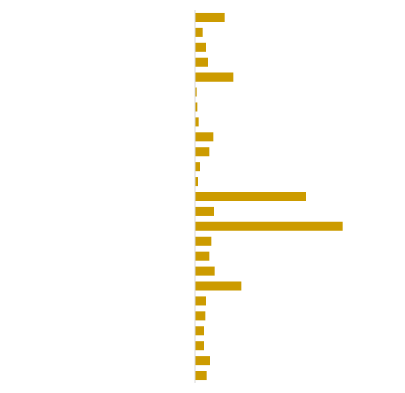
| Category | Total |
|---|---|
| Баацагаан сум | 16 |
| Баянбулаг сум | 21 |
| Баянговь сум | 12 |
| Баянлиг сум | 12 |
| Баян-Овоо сум | 14 |
| Баян-Өндөр сум | 15 |
| Баянхонгор аймгийн Засаг дарга | 68 |
| Баянхонгор сум | 28 |
| Баянцагаан сум | 20 |
| Богд сум | 23 |
| Боловсролын салбар | 220 |
| Бөмбөгөр сум | 27 |
| Бусад ТЕЗ-ийн харьяа | 165 |
| Бууцагаан сум | 3 |
| Галуут сум | 6 |
| Гурванбулаг сум | 20 |
| Жаргалант сум | 26 |
| Жинст сум | 4 |
| Заг сум | 2 |
| Өлзийт сум | 1 |
| Соёлын салбар | 56 |
| Хүрээмарал сум | 18 |
| Шинэжинст сум | 15 |
| Эрдэнэцогт сум | 10 |
| Эрүүл мэндийн салбар | 43 |